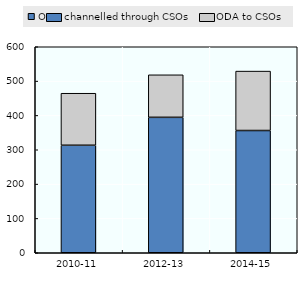
| Category | ODA channelled through CSOs | ODA to CSOs |
|---|---|---|
| 2010-11 | 313.138 | 151.492 |
| 2012-13 | 394.476 | 123.867 |
| 2014-15 | 356.032 | 173.105 |